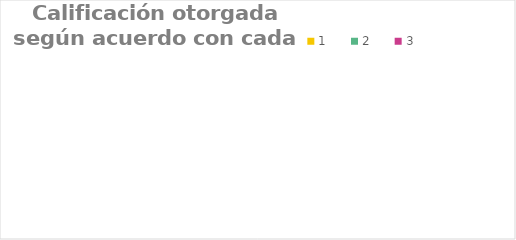
| Category | 1 | 2 | 3 | 4 | 5 |
|---|---|---|---|---|---|
| Los funcionarios públicos tienen suficientes conocimientos y habilidades en materia de transparencia | 27 | 37 | 20 | 15 | 5 |
| El gobierno debe invertir más recursos en acciones de transparencia | 13 | 13 | 26 | 24 | 29 |
| La información que difunde el gobierno es clara para que tomes decisiones en tu vida cotidiana | 22 | 37 | 23 | 10 | 5 |
| La información que difunde el gobierno es útil para tu vida cotidiana | 16 | 29 | 25 | 15 | 13 |
| Te gustaría que el gobierno te involucre en su toma de decisiones | 7 | 1 | 7 | 18 | 68 |